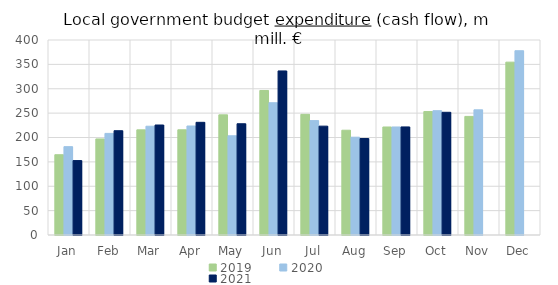
| Category | 2019 | 2020 | 2021 |
|---|---|---|---|
| Jan | 164652.4 | 181241.02 | 152675.552 |
| Feb | 197072.899 | 208405.475 | 213940.448 |
| Mar | 215668.168 | 223138.505 | 225624.876 |
| Apr | 215775.522 | 223577 | 231146.925 |
| May | 246465.222 | 203504.23 | 228193.448 |
| Jun | 296473.789 | 271297.77 | 336561.936 |
| Jul | 247478.069 | 234617.887 | 223275.425 |
| Aug | 214909.294 | 200617.365 | 197904.39 |
| Sep | 221544.637 | 221574.112 | 221712.162 |
| Oct | 253228.66 | 254993.621 | 251718.671 |
| Nov | 243238.54 | 256741.926 | 0 |
| Dec | 354571.434 | 378007.978 | 0 |